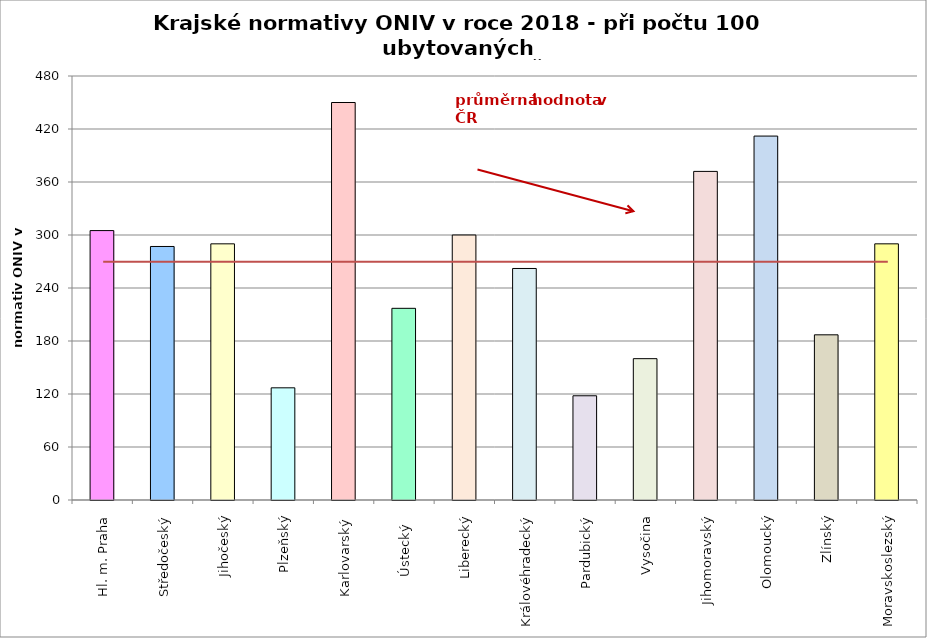
| Category | Series 0 |
|---|---|
| Hl. m. Praha | 305 |
| Středočeský | 287 |
| Jihočeský | 290 |
| Plzeňský | 127 |
| Karlovarský  | 450 |
| Ústecký   | 217 |
| Liberecký | 300 |
| Královéhradecký | 262.1 |
| Pardubický | 118 |
| Vysočina | 160 |
| Jihomoravský | 372 |
| Olomoucký | 412 |
| Zlínský | 187 |
| Moravskoslezský | 290 |